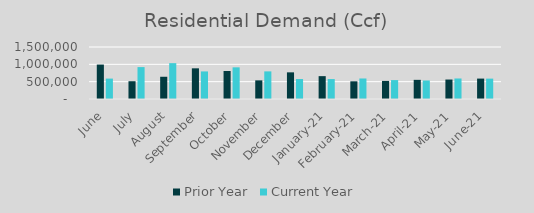
| Category | Prior Year | Current Year |
|---|---|---|
| June | 993563.54 | 588815.728 |
| July | 512849.55 | 920418.723 |
| August | 641515.25 | 1034271.241 |
| September | 884745.885 | 795392.365 |
| October | 808030.57 | 913450.318 |
| November | 537591.016 | 796803.85 |
| December | 768795.205 | 575698.992 |
| January-21 | 659359.876 | 574964.407 |
| February-21 | 510296.309 | 591912.627 |
| March-21 | 521598.856 | 545392.69 |
| April-21 | 552550.404 | 533967.423 |
| May-21 | 561680.927 | 591911.753 |
| June-21 | 588815.728 | 587861.265 |